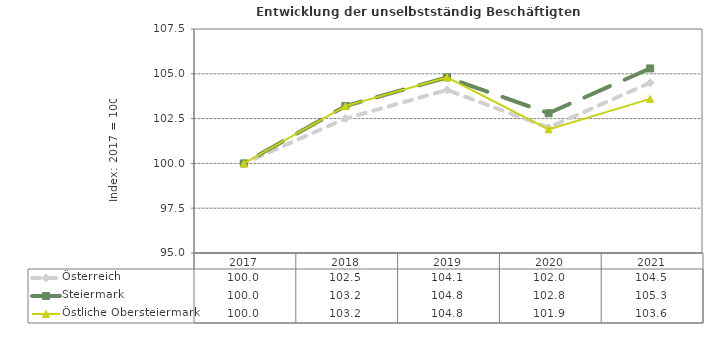
| Category | Österreich | Steiermark | Östliche Obersteiermark |
|---|---|---|---|
| 2021.0 | 104.5 | 105.3 | 103.6 |
| 2020.0 | 102 | 102.8 | 101.9 |
| 2019.0 | 104.1 | 104.8 | 104.8 |
| 2018.0 | 102.5 | 103.2 | 103.2 |
| 2017.0 | 100 | 100 | 100 |